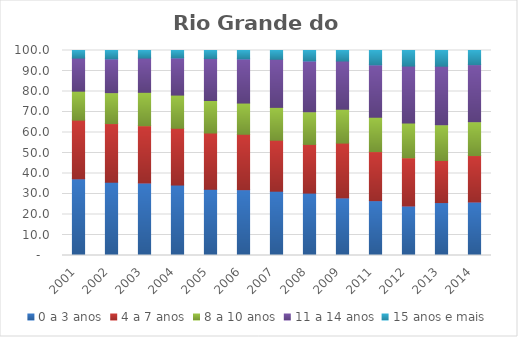
| Category | 0 a 3 anos | 4 a 7 anos | 8 a 10 anos | 11 a 14 anos | 15 anos e mais |
|---|---|---|---|---|---|
| 2001.0 | 37.42 | 28.61 | 14.13 | 16.13 | 3.7 |
| 2002.0 | 35.74 | 28.62 | 15.07 | 16.5 | 4.07 |
| 2003.0 | 35.38 | 27.93 | 16.29 | 16.7 | 3.7 |
| 2004.0 | 34.37 | 27.69 | 16.19 | 18.16 | 3.58 |
| 2005.0 | 32.29 | 27.46 | 15.87 | 20.45 | 3.94 |
| 2006.0 | 32.11 | 27.02 | 15.23 | 21.55 | 4.08 |
| 2007.0 | 31.36 | 24.87 | 16.03 | 23.46 | 4.29 |
| 2008.0 | 30.43 | 23.76 | 15.92 | 24.81 | 5.09 |
| 2009.0 | 28.11 | 26.72 | 16.52 | 23.52 | 5.13 |
| 2011.0 | 26.76 | 23.93 | 16.75 | 25.58 | 6.98 |
| 2012.0 | 24.16 | 23.52 | 16.94 | 27.8 | 7.58 |
| 2013.0 | 25.81 | 20.55 | 17.41 | 28.57 | 7.66 |
| 2014.0 | 26.1 | 22.66 | 16.5 | 27.85 | 6.89 |